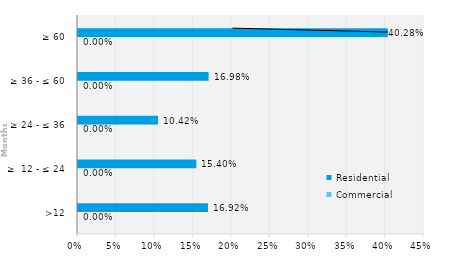
| Category | Commercial | Residential |
|---|---|---|
| >12 | 0 | 0.169 |
| ≥  12 - ≤ 24 | 0 | 0.154 |
| ≥ 24 - ≤ 36 | 0 | 0.104 |
| ≥ 36 - ≤ 60 | 0 | 0.17 |
| ≥ 60 | 0 | 0.403 |